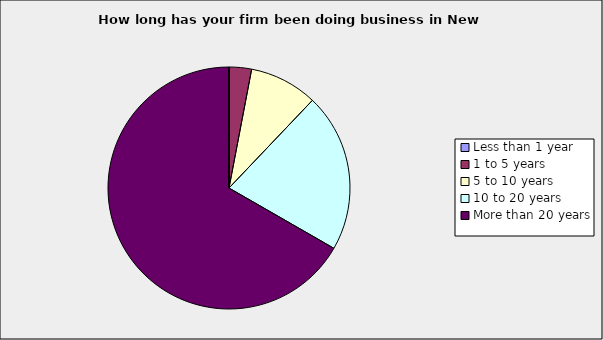
| Category | Series 0 |
|---|---|
| Less than 1 year | 0 |
| 1 to 5 years | 0.03 |
| 5 to 10 years | 0.091 |
| 10 to 20 years | 0.212 |
| More than 20 years | 0.667 |